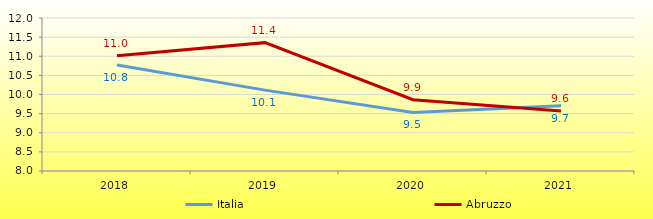
| Category | Italia | Abruzzo |
|---|---|---|
| 2018 | 10.77 | 11.014 |
| 2019 | 10.114 | 11.356 |
| 2020 | 9.53 | 9.863 |
| 2021 | 9.705 | 9.569 |